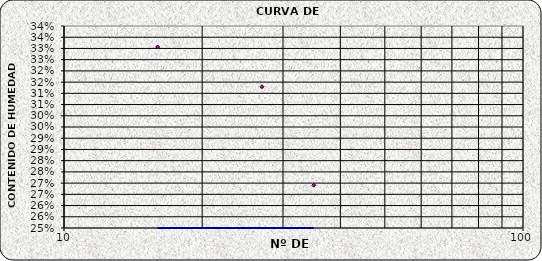
| Category | Series 0 |
|---|---|
| 35.0 | 0.269 |
| 27.0 | 0.313 |
| 16.0 | 0.331 |